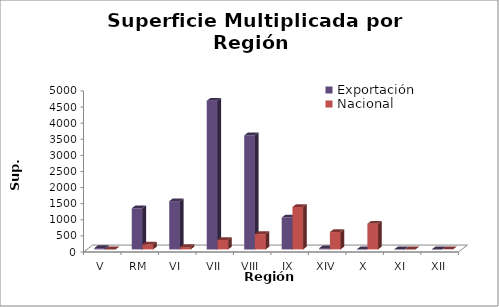
| Category | Exportación | Nacional |
|---|---|---|
| V | 39.9 | 0 |
| RM | 1275.959 | 154.5 |
| VI | 1497.106 | 70 |
| VII | 4615.118 | 292.54 |
| VIII | 3540.68 | 474.776 |
| IX | 989.06 | 1315.685 |
| XIV | 38 | 538.468 |
| X | 0 | 796.086 |
| XI | 0 | 0 |
| XII | 0 | 1.425 |